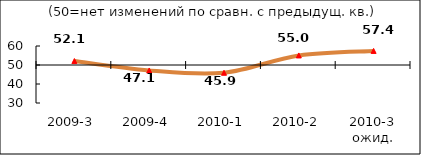
| Category | Диф.индекс ↓ |
|---|---|
| 2009-3 | 52.08 |
| 2009-4 | 47.12 |
| 2010-1 | 45.905 |
| 2010-2 | 55.03 |
| 2010-3 ожид. | 57.405 |